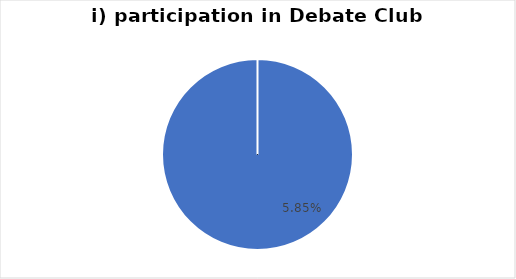
| Category | i) Debate Club |
|---|---|
| 0 | 0.058 |